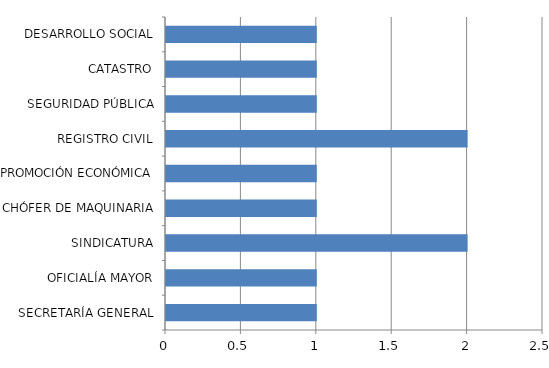
| Category | Series 0 |
|---|---|
| SECRETARÍA GENERAL | 1 |
| OFICIALÍA MAYOR | 1 |
| SINDICATURA | 2 |
| CHÓFER DE MAQUINARIA | 1 |
| PROMOCIÓN ECONÓMICA | 1 |
| REGISTRO CIVIL | 2 |
| SEGURIDAD PÚBLICA | 1 |
| CATASTRO | 1 |
| DESARROLLO SOCIAL | 1 |